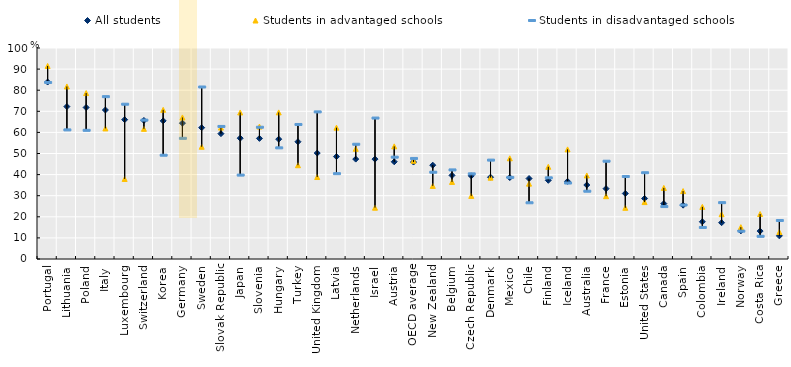
| Category | All students | Students in advantaged schools | Students in disadvantaged schools |
|---|---|---|---|
| Portugal | 83.873 | 91.481 | 83.649 |
| Lithuania | 72.225 | 81.773 | 61.186 |
| Poland | 71.812 | 78.652 | 60.985 |
| Italy | 70.611 | 61.888 | 76.945 |
| Luxembourg | 66.043 | 37.937 | 73.36 |
| Switzerland | 65.669 | 61.689 | 65.825 |
| Korea | 65.476 | 70.695 | 49.189 |
| Germany | 64.387 | 67.092 | 57.187 |
| Sweden | 62.248 | 53.196 | 81.518 |
| Slovak Republic | 59.401 | 62.281 | 62.82 |
| Japan | 57.256 | 69.439 | 39.763 |
| Slovenia | 57.16 | 62.755 | 62.443 |
| Hungary | 56.786 | 69.478 | 52.678 |
| Turkey | 55.574 | 44.441 | 63.754 |
| United Kingdom | 50.211 | 38.853 | 69.718 |
| Latvia | 48.532 | 62.243 | 40.447 |
| Netherlands | 47.342 | 52.229 | 54.378 |
| Israel | 47.339 | 24.317 | 66.798 |
| Austria | 46.086 | 53.385 | 48.263 |
| OECD average | 45.95 | 46.564 | 47.655 |
| New Zealand | 44.454 | 34.652 | 41.125 |
| Belgium | 39.635 | 36.533 | 42.217 |
| Czech Republic | 39.421 | 29.915 | 40.354 |
| Denmark | 38.759 | 38.559 | 46.861 |
| Mexico | 38.597 | 47.729 | 38.675 |
| Chile | 38.134 | 35.716 | 26.648 |
| Finland | 37.295 | 43.703 | 38.47 |
| Iceland | 36.8 | 51.948 | 36.001 |
| Australia | 35.069 | 39.59 | 32.118 |
| France | 33.335 | 29.769 | 46.347 |
| Estonia | 31.044 | 24.263 | 39.111 |
| United States | 28.68 | 26.972 | 40.88 |
| Canada | 26.249 | 33.697 | 24.85 |
| Spain | 25.513 | 32.203 | 25.584 |
| Colombia | 17.648 | 24.699 | 14.95 |
| Ireland | 17.211 | 21.226 | 26.707 |
| Norway | 13.328 | 15.093 | 13.194 |
| Costa Rica | 13.235 | 21.322 | 10.757 |
| Greece | 10.964 | 12.775 | 18.248 |